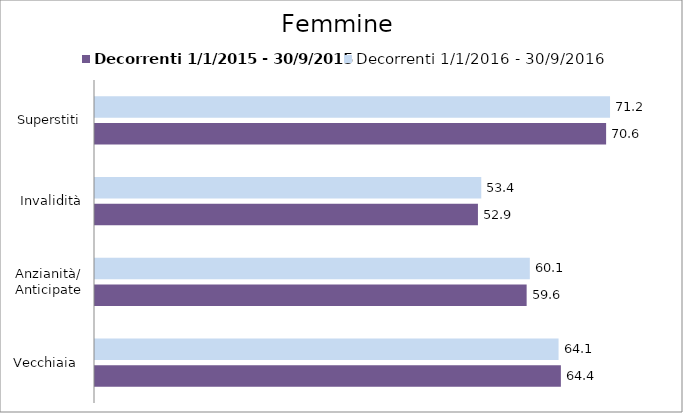
| Category | Decorrenti 1/1/2015 - 30/9/2015 | Decorrenti 1/1/2016 - 30/9/2016 |
|---|---|---|
| Vecchiaia  | 64.37 | 64.05 |
| Anzianità/ Anticipate | 59.64 | 60.08 |
| Invalidità | 52.91 | 53.37 |
| Superstiti | 70.62 | 71.16 |